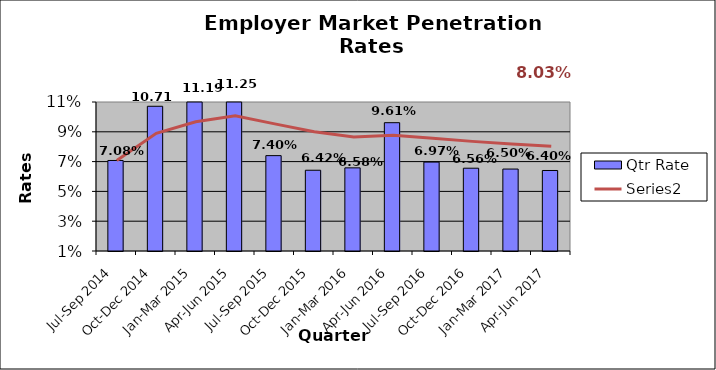
| Category | Qtr Rate |
|---|---|
| Jul-Sep 2014 | 0.071 |
| Oct-Dec 2014 | 0.107 |
| Jan-Mar 2015 | 0.112 |
| Apr-Jun 2015 | 0.112 |
| Jul-Sep 2015 | 0.074 |
| Oct-Dec 2015 | 0.064 |
| Jan-Mar 2016 | 0.066 |
| Apr-Jun 2016 | 0.096 |
| Jul-Sep 2016 | 0.07 |
| Oct-Dec 2016 | 0.066 |
| Jan-Mar 2017 | 0.065 |
| Apr-Jun 2017 | 0.064 |